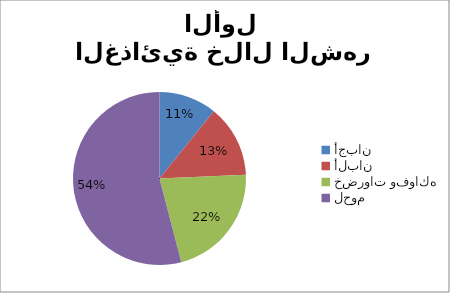
| Category | أجبان  ألبان  خضروات وفواكه لحوم  |
|---|---|
| أجبان  | 200 |
| ألبان  | 250 |
| خضروات وفواكه | 400 |
| لحوم  | 1000 |